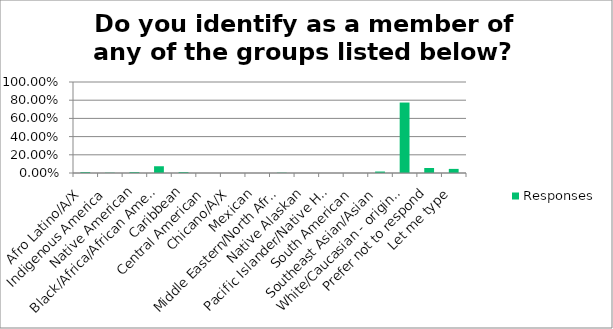
| Category | Responses |
|---|---|
| Afro Latino/A/X | 0.01 |
| Indigenous America | 0.003 |
| Native American | 0.01 |
| Black/Africa/African American | 0.074 |
| Caribbean | 0.01 |
| Central American | 0 |
| Chicano/A/X | 0 |
| Mexican | 0 |
| Middle Eastern/North African | 0.003 |
| Native Alaskan | 0 |
| Pacific Islander/Native Hawaiian | 0 |
| South American | 0 |
| Southeast Asian/Asian | 0.016 |
| White/Caucasian - origins in Europe, Middle East or North Africa | 0.774 |
| Prefer not to respond | 0.055 |
| Let me type | 0.045 |